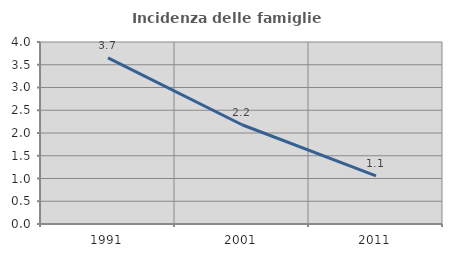
| Category | Incidenza delle famiglie numerose |
|---|---|
| 1991.0 | 3.653 |
| 2001.0 | 2.181 |
| 2011.0 | 1.057 |